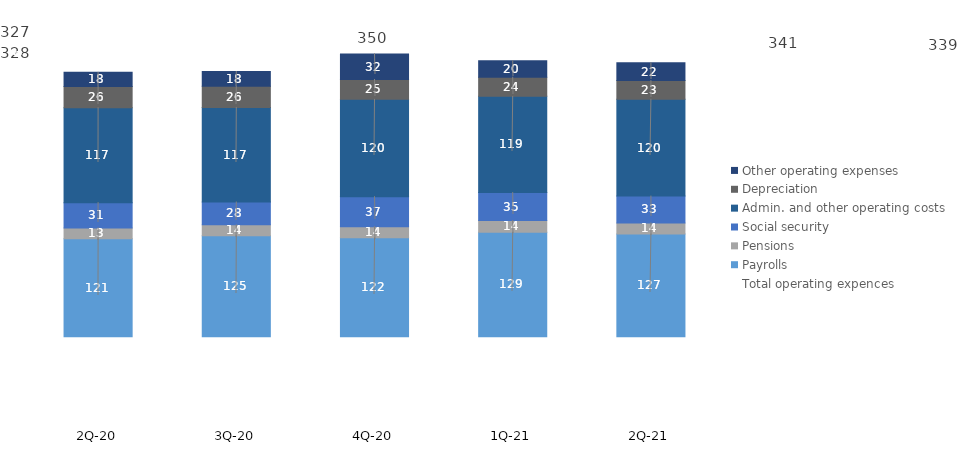
| Category | Payrolls | Pensions | Social security | Admin. and other operating costs | Depreciation | Other operating expenses |
|---|---|---|---|---|---|---|
| 2Q-21 | 127.068 | 13.765 | 33.197 | 119.901 | 23.043 | 22.058 |
| 1Q-21 | 129.226 | 14.478 | 34.637 | 119.105 | 23.716 | 20.338 |
| 4Q-20 | 122.325 | 13.853 | 37.12 | 120.434 | 24.617 | 31.658 |
| 3Q-20 | 124.922 | 13.51 | 28.236 | 117.066 | 26.116 | 18.311 |
| 2Q-20 | 121.292 | 13.37 | 31.266 | 117.403 | 26.314 | 17.514 |